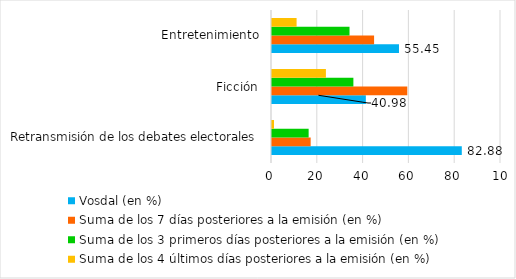
| Category | Vosdal (en %) | Suma de los 7 días posteriores a la emisión (en %) | Suma de los 3 primeros días posteriores a la emisión (en %) | Suma de los 4 últimos días posteriores a la emisión (en %) |
|---|---|---|---|---|
| Retransmisión de los debates electorales | 82.88 | 16.88 | 16 | 0.88 |
| Ficción | 40.98 | 59.08 | 35.54 | 23.54 |
| Entretenimiento | 55.45 | 44.58 | 33.85 | 10.74 |